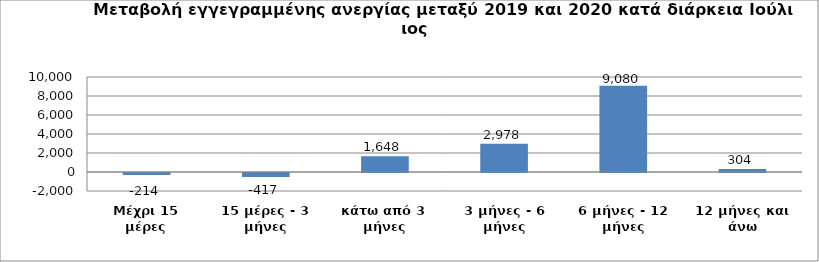
| Category | Series 0 |
|---|---|
| Μέχρι 15 μέρες | -214 |
| 15 μέρες - 3 μήνες | -417 |
| κάτω από 3 μήνες | 1648 |
| 3 μήνες - 6 μήνες | 2978 |
| 6 μήνες - 12 μήνες | 9080 |
| 12 μήνες και άνω | 304 |